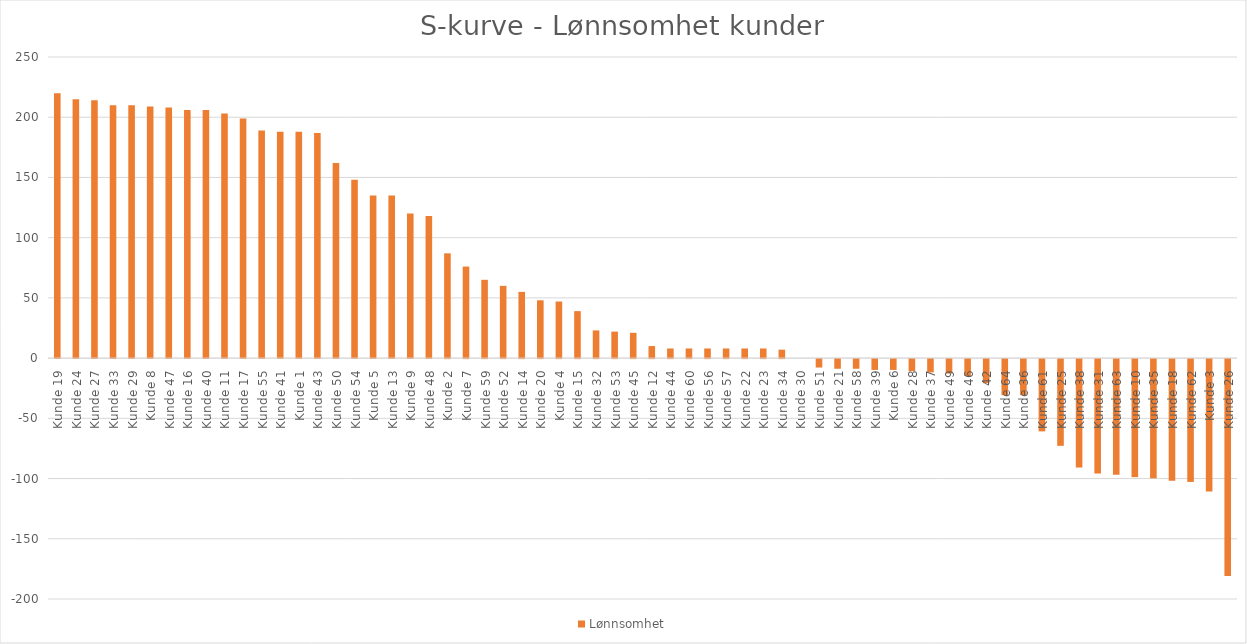
| Category | Lønnsomhet |
|---|---|
| Kunde 19 | 220 |
| Kunde 24 | 215 |
| Kunde 27 | 214 |
| Kunde 33 | 210 |
| Kunde 29 | 210 |
| Kunde 8 | 209 |
| Kunde 47 | 208 |
| Kunde 16 | 206 |
| Kunde 40 | 206 |
| Kunde 11 | 203 |
| Kunde 17 | 199 |
| Kunde 55 | 189 |
| Kunde 41 | 188 |
| Kunde 1 | 188 |
| Kunde 43 | 187 |
| Kunde 50 | 162 |
| Kunde 54 | 148 |
| Kunde 5 | 135 |
| Kunde 13 | 135 |
| Kunde 9 | 120 |
| Kunde 48 | 118 |
| Kunde 2 | 87 |
| Kunde 7 | 76 |
| Kunde 59 | 65 |
| Kunde 52 | 60 |
| Kunde 14 | 55 |
| Kunde 20 | 48 |
| Kunde 4 | 47 |
| Kunde 15 | 39 |
| Kunde 32 | 23 |
| Kunde 53 | 22 |
| Kunde 45 | 21 |
| Kunde 12 | 10 |
| Kunde 44 | 8 |
| Kunde 60 | 8 |
| Kunde 56 | 8 |
| Kunde 57 | 8 |
| Kunde 22 | 8 |
| Kunde 23 | 8 |
| Kunde 34 | 7 |
| Kunde 30 | 0 |
| Kunde 51 | -7 |
| Kunde 21 | -8 |
| Kunde 58 | -8 |
| Kunde 39 | -9 |
| Kunde 6 | -9 |
| Kunde 28 | -10 |
| Kunde 37 | -11 |
| Kunde 49 | -12 |
| Kunde 46 | -14 |
| Kunde 42 | -20 |
| Kunde 64 | -30 |
| Kunde 36 | -30 |
| Kunde 61 | -60 |
| Kunde 25 | -72 |
| Kunde 38 | -90 |
| Kunde 31 | -95 |
| Kunde 63 | -96 |
| Kunde 10 | -98 |
| Kunde 35 | -99 |
| Kunde 18 | -101 |
| Kunde 62 | -102 |
| Kunde 3 | -110 |
| Kunde 26 | -180 |